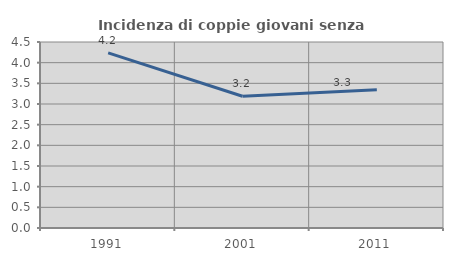
| Category | Incidenza di coppie giovani senza figli |
|---|---|
| 1991.0 | 4.238 |
| 2001.0 | 3.187 |
| 2011.0 | 3.342 |